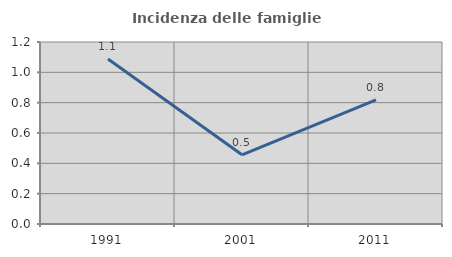
| Category | Incidenza delle famiglie numerose |
|---|---|
| 1991.0 | 1.088 |
| 2001.0 | 0.456 |
| 2011.0 | 0.818 |